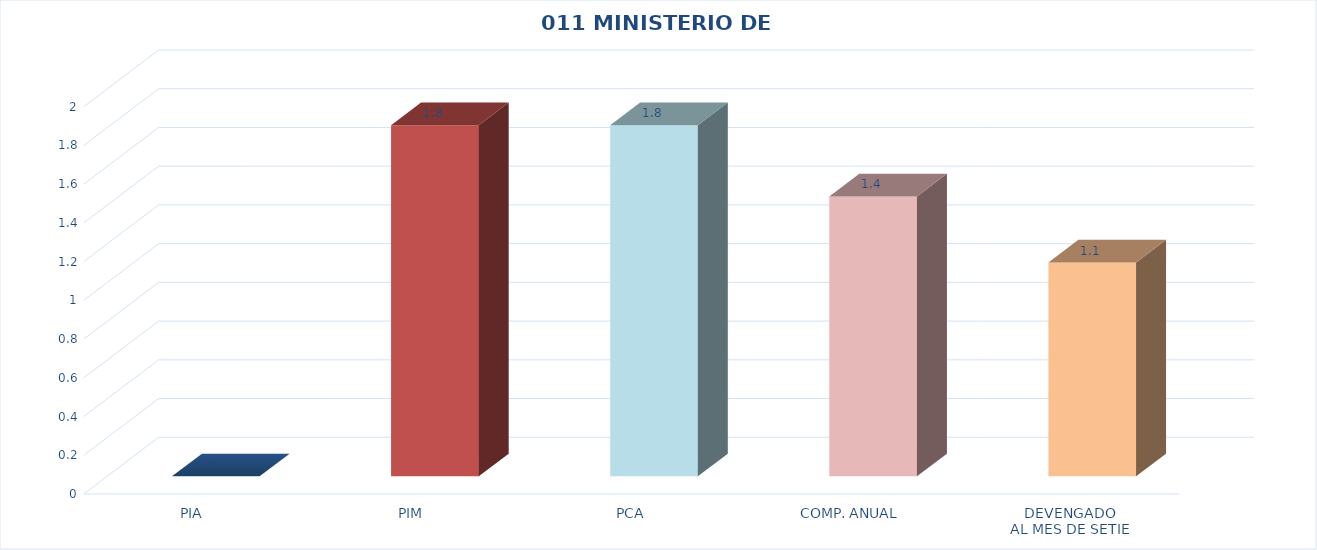
| Category | 011 MINISTERIO DE SALUD |
|---|---|
| PIA | 0 |
| PIM | 1.813 |
| PCA | 1.813 |
| COMP. ANUAL | 1.445 |
| DEVENGADO
AL MES DE SETIE | 1.104 |